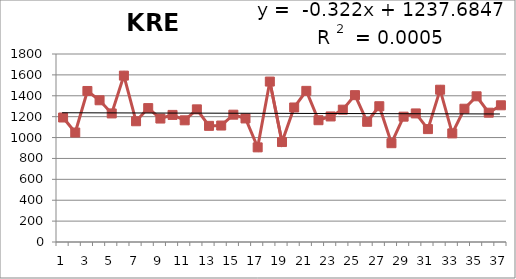
| Category | 1976-2012 |
|---|---|
| 0 | 1192 |
| 1 | 1048 |
| 2 | 1446 |
| 3 | 1357 |
| 4 | 1231 |
| 5 | 1593 |
| 6 | 1156 |
| 7 | 1282 |
| 8 | 1182 |
| 9 | 1217 |
| 10 | 1165 |
| 11 | 1270 |
| 12 | 1112 |
| 13 | 1115 |
| 14 | 1219 |
| 15 | 1183 |
| 16 | 906 |
| 17 | 1536 |
| 18 | 957 |
| 19 | 1288 |
| 20 | 1447 |
| 21 | 1166 |
| 22 | 1202 |
| 23 | 1267 |
| 24 | 1406 |
| 25 | 1151 |
| 26 | 1300 |
| 27 | 946 |
| 28 | 1200 |
| 29 | 1231 |
| 30 | 1081 |
| 31 | 1458 |
| 32 | 1040 |
| 33 | 1276 |
| 34 | 1395 |
| 35 | 1238 |
| 36 | 1309 |